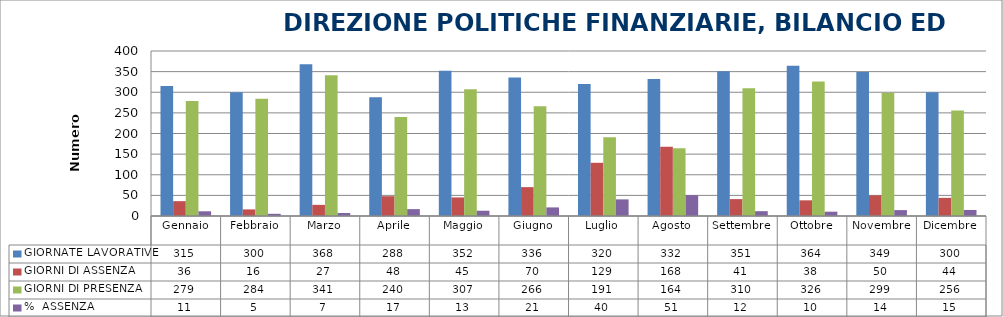
| Category | GIORNATE LAVORATIVE | GIORNI DI ASSENZA | GIORNI DI PRESENZA | %  ASSENZA |
|---|---|---|---|---|
| Gennaio | 315 | 36 | 279 | 11.429 |
| Febbraio | 300 | 16 | 284 | 5.333 |
| Marzo | 368 | 27 | 341 | 7.337 |
| Aprile | 288 | 48 | 240 | 16.667 |
| Maggio | 352 | 45 | 307 | 12.784 |
| Giugno | 336 | 70 | 266 | 20.833 |
| Luglio | 320 | 129 | 191 | 40.312 |
| Agosto | 332 | 168 | 164 | 50.602 |
| Settembre | 351 | 41 | 310 | 11.681 |
| Ottobre | 364 | 38 | 326 | 10.44 |
| Novembre | 349 | 50 | 299 | 14.327 |
| Dicembre | 300 | 44 | 256 | 14.667 |